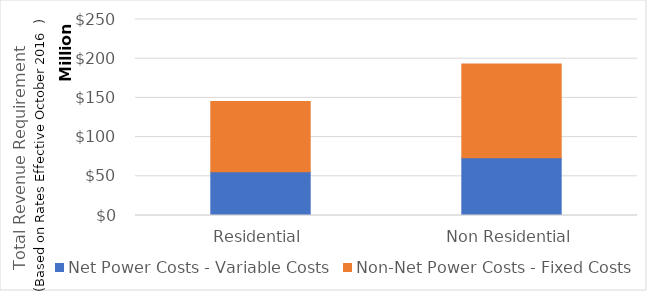
| Category | Net Power Costs - Variable Costs | Non-Net Power Costs - Fixed Costs |
|---|---|---|
| Residential | 55772733.752 | 89582506.281 |
| Non Residential | 73666730.696 | 119531090.03 |